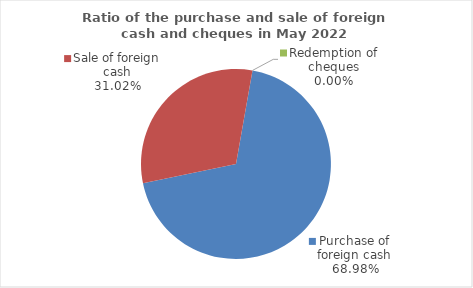
| Category | Series 0 |
|---|---|
| Purchase of foreign cash | 68.98 |
| Sale of foreign cash | 31.02 |
| Redemption of cheques | 0 |